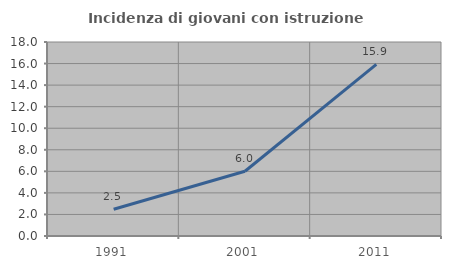
| Category | Incidenza di giovani con istruzione universitaria |
|---|---|
| 1991.0 | 2.486 |
| 2001.0 | 6.011 |
| 2011.0 | 15.929 |